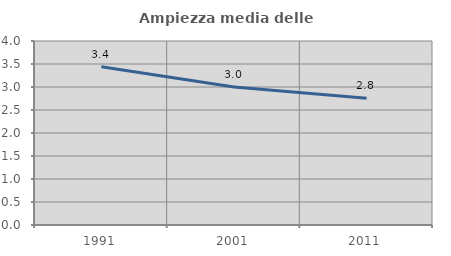
| Category | Ampiezza media delle famiglie |
|---|---|
| 1991.0 | 3.439 |
| 2001.0 | 3 |
| 2011.0 | 2.754 |